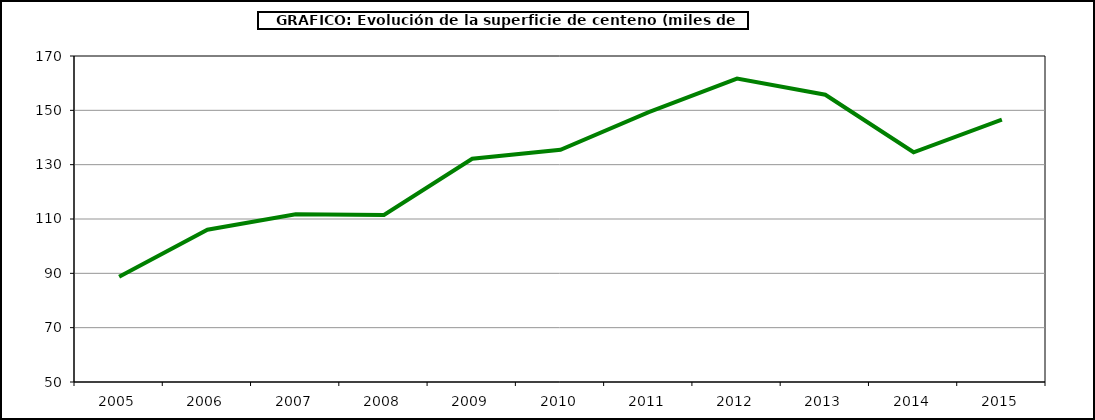
| Category | Superficie |
|---|---|
| 2005.0 | 88.746 |
| 2006.0 | 106.073 |
| 2007.0 | 111.744 |
| 2008.0 | 111.513 |
| 2009.0 | 132.161 |
| 2010.0 | 135.488 |
| 2011.0 | 149.321 |
| 2012.0 | 161.702 |
| 2013.0 | 155.734 |
| 2014.0 | 134.563 |
| 2015.0 | 146.625 |